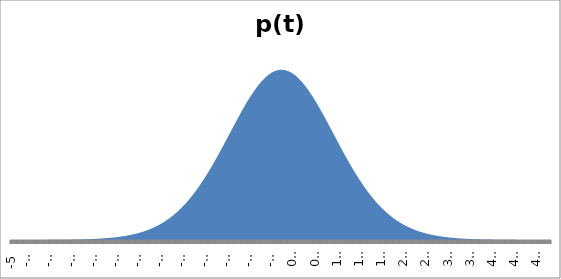
| Category | p(t) |
|---|---|
| -5.0 | 0 |
| -4.99 | 0 |
| -4.98 | 0 |
| -4.970000000000001 | 0 |
| -4.960000000000001 | 0 |
| -4.950000000000001 | 0 |
| -4.940000000000001 | 0 |
| -4.9300000000000015 | 0 |
| -4.920000000000002 | 0 |
| -4.910000000000002 | 0 |
| -4.900000000000002 | 0 |
| -4.890000000000002 | 0 |
| -4.880000000000003 | 0 |
| -4.870000000000003 | 0 |
| -4.860000000000003 | 0 |
| -4.850000000000003 | 0 |
| -4.840000000000003 | 0 |
| -4.830000000000004 | 0 |
| -4.820000000000004 | 0 |
| -4.810000000000004 | 0 |
| -4.800000000000004 | 0 |
| -4.7900000000000045 | 0 |
| -4.780000000000005 | 0 |
| -4.770000000000005 | 0 |
| -4.760000000000005 | 0 |
| -4.750000000000005 | 0 |
| -4.7400000000000055 | 0 |
| -4.730000000000006 | 0 |
| -4.720000000000006 | 0 |
| -4.710000000000006 | 0 |
| -4.700000000000006 | 0 |
| -4.690000000000007 | 0 |
| -4.680000000000007 | 0 |
| -4.670000000000007 | 0 |
| -4.660000000000007 | 0 |
| -4.6500000000000075 | 0 |
| -4.640000000000008 | 0 |
| -4.630000000000008 | 0 |
| -4.620000000000008 | 0 |
| -4.610000000000008 | 0 |
| -4.6000000000000085 | 0 |
| -4.590000000000009 | 0 |
| -4.580000000000009 | 0 |
| -4.570000000000009 | 0 |
| -4.560000000000009 | 0 |
| -4.55000000000001 | 0 |
| -4.54000000000001 | 0 |
| -4.53000000000001 | 0 |
| -4.52000000000001 | 0 |
| -4.5100000000000104 | 0 |
| -4.500000000000011 | 0 |
| -4.490000000000011 | 0 |
| -4.480000000000011 | 0 |
| -4.470000000000011 | 0 |
| -4.4600000000000115 | 0 |
| -4.450000000000012 | 0 |
| -4.440000000000012 | 0 |
| -4.430000000000012 | 0 |
| -4.420000000000012 | 0 |
| -4.410000000000013 | 0 |
| -4.400000000000013 | 0 |
| -4.390000000000013 | 0 |
| -4.380000000000013 | 0 |
| -4.370000000000013 | 0 |
| -4.360000000000014 | 0 |
| -4.350000000000014 | 0 |
| -4.340000000000014 | 0 |
| -4.330000000000014 | 0 |
| -4.3200000000000145 | 0 |
| -4.310000000000015 | 0 |
| -4.300000000000015 | 0 |
| -4.290000000000015 | 0 |
| -4.280000000000015 | 0 |
| -4.270000000000016 | 0 |
| -4.260000000000016 | 0 |
| -4.250000000000016 | 0 |
| -4.240000000000016 | 0 |
| -4.230000000000016 | 0 |
| -4.220000000000017 | 0 |
| -4.210000000000017 | 0 |
| -4.200000000000017 | 0 |
| -4.190000000000017 | 0 |
| -4.1800000000000175 | 0 |
| -4.170000000000018 | 0 |
| -4.160000000000018 | 0 |
| -4.150000000000018 | 0 |
| -4.140000000000018 | 0 |
| -4.1300000000000185 | 0 |
| -4.120000000000019 | 0 |
| -4.110000000000019 | 0.001 |
| -4.100000000000019 | 0.001 |
| -4.090000000000019 | 0.001 |
| -4.08000000000002 | 0.001 |
| -4.07000000000002 | 0.001 |
| -4.06000000000002 | 0.001 |
| -4.05000000000002 | 0.001 |
| -4.0400000000000205 | 0.001 |
| -4.030000000000021 | 0.001 |
| -4.020000000000021 | 0.001 |
| -4.010000000000021 | 0.001 |
| -4.000000000000021 | 0.001 |
| -3.9900000000000215 | 0.001 |
| -3.9800000000000217 | 0.001 |
| -3.970000000000022 | 0.001 |
| -3.960000000000022 | 0.001 |
| -3.9500000000000224 | 0.001 |
| -3.9400000000000226 | 0.001 |
| -3.930000000000023 | 0.001 |
| -3.920000000000023 | 0.001 |
| -3.9100000000000232 | 0.001 |
| -3.9000000000000234 | 0.001 |
| -3.8900000000000237 | 0.001 |
| -3.880000000000024 | 0.001 |
| -3.870000000000024 | 0.001 |
| -3.8600000000000243 | 0.001 |
| -3.8500000000000245 | 0.001 |
| -3.8400000000000247 | 0.001 |
| -3.830000000000025 | 0.001 |
| -3.820000000000025 | 0.001 |
| -3.8100000000000254 | 0.001 |
| -3.8000000000000256 | 0.001 |
| -3.790000000000026 | 0.001 |
| -3.780000000000026 | 0.001 |
| -3.770000000000026 | 0.001 |
| -3.7600000000000264 | 0.001 |
| -3.7500000000000266 | 0.001 |
| -3.740000000000027 | 0.001 |
| -3.730000000000027 | 0.001 |
| -3.7200000000000273 | 0.001 |
| -3.7100000000000275 | 0.001 |
| -3.7000000000000277 | 0.001 |
| -3.690000000000028 | 0.001 |
| -3.680000000000028 | 0.001 |
| -3.6700000000000284 | 0.002 |
| -3.6600000000000286 | 0.002 |
| -3.6500000000000288 | 0.002 |
| -3.640000000000029 | 0.002 |
| -3.630000000000029 | 0.002 |
| -3.6200000000000294 | 0.002 |
| -3.6100000000000296 | 0.002 |
| -3.60000000000003 | 0.002 |
| -3.59000000000003 | 0.002 |
| -3.5800000000000303 | 0.002 |
| -3.5700000000000305 | 0.002 |
| -3.5600000000000307 | 0.002 |
| -3.550000000000031 | 0.002 |
| -3.540000000000031 | 0.002 |
| -3.5300000000000313 | 0.002 |
| -3.5200000000000315 | 0.002 |
| -3.5100000000000318 | 0.002 |
| -3.500000000000032 | 0.002 |
| -3.490000000000032 | 0.002 |
| -3.4800000000000324 | 0.002 |
| -3.4700000000000326 | 0.002 |
| -3.460000000000033 | 0.003 |
| -3.450000000000033 | 0.003 |
| -3.4400000000000333 | 0.003 |
| -3.4300000000000335 | 0.003 |
| -3.4200000000000337 | 0.003 |
| -3.410000000000034 | 0.003 |
| -3.400000000000034 | 0.003 |
| -3.3900000000000343 | 0.003 |
| -3.3800000000000345 | 0.003 |
| -3.3700000000000347 | 0.003 |
| -3.360000000000035 | 0.003 |
| -3.350000000000035 | 0.003 |
| -3.3400000000000354 | 0.003 |
| -3.3300000000000356 | 0.003 |
| -3.320000000000036 | 0.004 |
| -3.310000000000036 | 0.004 |
| -3.3000000000000362 | 0.004 |
| -3.2900000000000365 | 0.004 |
| -3.2800000000000367 | 0.004 |
| -3.270000000000037 | 0.004 |
| -3.260000000000037 | 0.004 |
| -3.2500000000000373 | 0.004 |
| -3.2400000000000375 | 0.004 |
| -3.2300000000000377 | 0.004 |
| -3.220000000000038 | 0.004 |
| -3.210000000000038 | 0.005 |
| -3.2000000000000384 | 0.005 |
| -3.1900000000000386 | 0.005 |
| -3.180000000000039 | 0.005 |
| -3.170000000000039 | 0.005 |
| -3.160000000000039 | 0.005 |
| -3.1500000000000394 | 0.005 |
| -3.1400000000000396 | 0.005 |
| -3.13000000000004 | 0.005 |
| -3.12000000000004 | 0.006 |
| -3.1100000000000403 | 0.006 |
| -3.1000000000000405 | 0.006 |
| -3.0900000000000407 | 0.006 |
| -3.080000000000041 | 0.006 |
| -3.070000000000041 | 0.006 |
| -3.0600000000000414 | 0.006 |
| -3.0500000000000416 | 0.007 |
| -3.040000000000042 | 0.007 |
| -3.030000000000042 | 0.007 |
| -3.020000000000042 | 0.007 |
| -3.0100000000000424 | 0.007 |
| -3.0000000000000426 | 0.007 |
| -2.990000000000043 | 0.008 |
| -2.980000000000043 | 0.008 |
| -2.9700000000000433 | 0.008 |
| -2.9600000000000435 | 0.008 |
| -2.9500000000000437 | 0.008 |
| -2.940000000000044 | 0.008 |
| -2.930000000000044 | 0.009 |
| -2.9200000000000443 | 0.009 |
| -2.9100000000000446 | 0.009 |
| -2.9000000000000448 | 0.009 |
| -2.890000000000045 | 0.009 |
| -2.880000000000045 | 0.01 |
| -2.8700000000000454 | 0.01 |
| -2.8600000000000456 | 0.01 |
| -2.850000000000046 | 0.01 |
| -2.840000000000046 | 0.011 |
| -2.8300000000000463 | 0.011 |
| -2.8200000000000465 | 0.011 |
| -2.8100000000000467 | 0.011 |
| -2.800000000000047 | 0.012 |
| -2.790000000000047 | 0.012 |
| -2.7800000000000473 | 0.012 |
| -2.7700000000000475 | 0.012 |
| -2.7600000000000477 | 0.013 |
| -2.750000000000048 | 0.013 |
| -2.740000000000048 | 0.013 |
| -2.7300000000000484 | 0.013 |
| -2.7200000000000486 | 0.014 |
| -2.710000000000049 | 0.014 |
| -2.700000000000049 | 0.014 |
| -2.6900000000000492 | 0.015 |
| -2.6800000000000495 | 0.015 |
| -2.6700000000000497 | 0.015 |
| -2.66000000000005 | 0.016 |
| -2.65000000000005 | 0.016 |
| -2.6400000000000503 | 0.016 |
| -2.6300000000000505 | 0.017 |
| -2.6200000000000507 | 0.017 |
| -2.610000000000051 | 0.017 |
| -2.600000000000051 | 0.018 |
| -2.5900000000000514 | 0.018 |
| -2.5800000000000516 | 0.019 |
| -2.570000000000052 | 0.019 |
| -2.560000000000052 | 0.019 |
| -2.5500000000000522 | 0.02 |
| -2.5400000000000524 | 0.02 |
| -2.5300000000000527 | 0.021 |
| -2.520000000000053 | 0.021 |
| -2.510000000000053 | 0.021 |
| -2.5000000000000533 | 0.022 |
| -2.4900000000000535 | 0.022 |
| -2.4800000000000537 | 0.023 |
| -2.470000000000054 | 0.023 |
| -2.460000000000054 | 0.024 |
| -2.4500000000000544 | 0.024 |
| -2.4400000000000546 | 0.025 |
| -2.430000000000055 | 0.025 |
| -2.420000000000055 | 0.026 |
| -2.410000000000055 | 0.026 |
| -2.4000000000000554 | 0.027 |
| -2.3900000000000556 | 0.027 |
| -2.380000000000056 | 0.028 |
| -2.370000000000056 | 0.028 |
| -2.3600000000000563 | 0.029 |
| -2.3500000000000565 | 0.03 |
| -2.3400000000000567 | 0.03 |
| -2.330000000000057 | 0.031 |
| -2.320000000000057 | 0.031 |
| -2.3100000000000573 | 0.032 |
| -2.3000000000000576 | 0.033 |
| -2.2900000000000578 | 0.033 |
| -2.280000000000058 | 0.034 |
| -2.270000000000058 | 0.035 |
| -2.2600000000000584 | 0.035 |
| -2.2500000000000586 | 0.036 |
| -2.240000000000059 | 0.037 |
| -2.230000000000059 | 0.038 |
| -2.2200000000000593 | 0.038 |
| -2.2100000000000595 | 0.039 |
| -2.2000000000000597 | 0.04 |
| -2.19000000000006 | 0.04 |
| -2.18000000000006 | 0.041 |
| -2.1700000000000603 | 0.042 |
| -2.1600000000000605 | 0.043 |
| -2.1500000000000608 | 0.044 |
| -2.140000000000061 | 0.044 |
| -2.130000000000061 | 0.045 |
| -2.1200000000000614 | 0.046 |
| -2.1100000000000616 | 0.047 |
| -2.100000000000062 | 0.048 |
| -2.090000000000062 | 0.049 |
| -2.0800000000000622 | 0.05 |
| -2.0700000000000625 | 0.051 |
| -2.0600000000000627 | 0.052 |
| -2.050000000000063 | 0.053 |
| -2.040000000000063 | 0.053 |
| -2.0300000000000633 | 0.054 |
| -2.0200000000000635 | 0.055 |
| -2.0100000000000637 | 0.056 |
| -2.000000000000064 | 0.057 |
| -1.990000000000064 | 0.059 |
| -1.980000000000064 | 0.06 |
| -1.970000000000064 | 0.061 |
| -1.960000000000064 | 0.062 |
| -1.950000000000064 | 0.063 |
| -1.940000000000064 | 0.064 |
| -1.9300000000000639 | 0.065 |
| -1.9200000000000639 | 0.066 |
| -1.9100000000000639 | 0.067 |
| -1.9000000000000639 | 0.069 |
| -1.8900000000000639 | 0.07 |
| -1.8800000000000638 | 0.071 |
| -1.8700000000000638 | 0.072 |
| -1.8600000000000638 | 0.073 |
| -1.8500000000000638 | 0.075 |
| -1.8400000000000638 | 0.076 |
| -1.8300000000000638 | 0.077 |
| -1.8200000000000638 | 0.078 |
| -1.8100000000000638 | 0.08 |
| -1.8000000000000638 | 0.081 |
| -1.7900000000000638 | 0.082 |
| -1.7800000000000638 | 0.084 |
| -1.7700000000000637 | 0.085 |
| -1.7600000000000637 | 0.087 |
| -1.7500000000000637 | 0.088 |
| -1.7400000000000637 | 0.089 |
| -1.7300000000000637 | 0.091 |
| -1.7200000000000637 | 0.092 |
| -1.7100000000000637 | 0.094 |
| -1.7000000000000637 | 0.095 |
| -1.6900000000000637 | 0.097 |
| -1.6800000000000637 | 0.098 |
| -1.6700000000000637 | 0.1 |
| -1.6600000000000636 | 0.101 |
| -1.6500000000000636 | 0.103 |
| -1.6400000000000636 | 0.105 |
| -1.6300000000000636 | 0.106 |
| -1.6200000000000636 | 0.108 |
| -1.6100000000000636 | 0.11 |
| -1.6000000000000636 | 0.111 |
| -1.5900000000000636 | 0.113 |
| -1.5800000000000636 | 0.115 |
| -1.5700000000000636 | 0.116 |
| -1.5600000000000636 | 0.118 |
| -1.5500000000000635 | 0.12 |
| -1.5400000000000635 | 0.122 |
| -1.5300000000000635 | 0.123 |
| -1.5200000000000635 | 0.125 |
| -1.5100000000000635 | 0.127 |
| -1.5000000000000635 | 0.129 |
| -1.4900000000000635 | 0.131 |
| -1.4800000000000635 | 0.133 |
| -1.4700000000000635 | 0.134 |
| -1.4600000000000635 | 0.136 |
| -1.4500000000000635 | 0.138 |
| -1.4400000000000635 | 0.14 |
| -1.4300000000000634 | 0.142 |
| -1.4200000000000634 | 0.144 |
| -1.4100000000000634 | 0.146 |
| -1.4000000000000634 | 0.148 |
| -1.3900000000000634 | 0.15 |
| -1.3800000000000634 | 0.152 |
| -1.3700000000000634 | 0.154 |
| -1.3600000000000634 | 0.156 |
| -1.3500000000000634 | 0.158 |
| -1.3400000000000634 | 0.16 |
| -1.3300000000000634 | 0.162 |
| -1.3200000000000633 | 0.164 |
| -1.3100000000000633 | 0.167 |
| -1.3000000000000633 | 0.169 |
| -1.2900000000000633 | 0.171 |
| -1.2800000000000633 | 0.173 |
| -1.2700000000000633 | 0.175 |
| -1.2600000000000633 | 0.177 |
| -1.2500000000000633 | 0.179 |
| -1.2400000000000633 | 0.182 |
| -1.2300000000000633 | 0.184 |
| -1.2200000000000633 | 0.186 |
| -1.2100000000000632 | 0.188 |
| -1.2000000000000632 | 0.191 |
| -1.1900000000000632 | 0.193 |
| -1.1800000000000632 | 0.195 |
| -1.1700000000000632 | 0.197 |
| -1.1600000000000632 | 0.2 |
| -1.1500000000000632 | 0.202 |
| -1.1400000000000632 | 0.204 |
| -1.1300000000000632 | 0.207 |
| -1.1200000000000632 | 0.209 |
| -1.1100000000000632 | 0.211 |
| -1.1000000000000631 | 0.213 |
| -1.0900000000000631 | 0.216 |
| -1.0800000000000631 | 0.218 |
| -1.0700000000000631 | 0.22 |
| -1.0600000000000631 | 0.223 |
| -1.050000000000063 | 0.225 |
| -1.040000000000063 | 0.228 |
| -1.030000000000063 | 0.23 |
| -1.020000000000063 | 0.232 |
| -1.010000000000063 | 0.235 |
| -1.000000000000063 | 0.237 |
| -0.990000000000063 | 0.239 |
| -0.980000000000063 | 0.242 |
| -0.970000000000063 | 0.244 |
| -0.960000000000063 | 0.247 |
| -0.950000000000063 | 0.249 |
| -0.940000000000063 | 0.251 |
| -0.930000000000063 | 0.254 |
| -0.920000000000063 | 0.256 |
| -0.910000000000063 | 0.258 |
| -0.900000000000063 | 0.261 |
| -0.890000000000063 | 0.263 |
| -0.880000000000063 | 0.265 |
| -0.870000000000063 | 0.268 |
| -0.8600000000000629 | 0.27 |
| -0.8500000000000629 | 0.273 |
| -0.8400000000000629 | 0.275 |
| -0.8300000000000629 | 0.277 |
| -0.8200000000000629 | 0.28 |
| -0.8100000000000629 | 0.282 |
| -0.8000000000000629 | 0.284 |
| -0.7900000000000629 | 0.286 |
| -0.7800000000000629 | 0.289 |
| -0.7700000000000629 | 0.291 |
| -0.7600000000000628 | 0.293 |
| -0.7500000000000628 | 0.296 |
| -0.7400000000000628 | 0.298 |
| -0.7300000000000628 | 0.3 |
| -0.7200000000000628 | 0.302 |
| -0.7100000000000628 | 0.304 |
| -0.7000000000000628 | 0.307 |
| -0.6900000000000628 | 0.309 |
| -0.6800000000000628 | 0.311 |
| -0.6700000000000628 | 0.313 |
| -0.6600000000000628 | 0.315 |
| -0.6500000000000627 | 0.317 |
| -0.6400000000000627 | 0.32 |
| -0.6300000000000627 | 0.322 |
| -0.6200000000000627 | 0.324 |
| -0.6100000000000627 | 0.326 |
| -0.6000000000000627 | 0.328 |
| -0.5900000000000627 | 0.33 |
| -0.5800000000000627 | 0.332 |
| -0.5700000000000627 | 0.334 |
| -0.5600000000000627 | 0.336 |
| -0.5500000000000627 | 0.338 |
| -0.5400000000000627 | 0.339 |
| -0.5300000000000626 | 0.341 |
| -0.5200000000000626 | 0.343 |
| -0.5100000000000626 | 0.345 |
| -0.5000000000000626 | 0.347 |
| -0.4900000000000626 | 0.349 |
| -0.4800000000000626 | 0.35 |
| -0.4700000000000626 | 0.352 |
| -0.4600000000000626 | 0.354 |
| -0.45000000000006257 | 0.355 |
| -0.44000000000006256 | 0.357 |
| -0.43000000000006255 | 0.359 |
| -0.42000000000006255 | 0.36 |
| -0.41000000000006254 | 0.362 |
| -0.40000000000006253 | 0.363 |
| -0.3900000000000625 | 0.365 |
| -0.3800000000000625 | 0.366 |
| -0.3700000000000625 | 0.368 |
| -0.3600000000000625 | 0.369 |
| -0.3500000000000625 | 0.37 |
| -0.3400000000000625 | 0.372 |
| -0.33000000000006247 | 0.373 |
| -0.32000000000006246 | 0.374 |
| -0.31000000000006245 | 0.376 |
| -0.30000000000006244 | 0.377 |
| -0.29000000000006243 | 0.378 |
| -0.2800000000000624 | 0.379 |
| -0.2700000000000624 | 0.38 |
| -0.2600000000000624 | 0.381 |
| -0.2500000000000624 | 0.382 |
| -0.24000000000006239 | 0.383 |
| -0.23000000000006238 | 0.384 |
| -0.22000000000006237 | 0.385 |
| -0.21000000000006236 | 0.386 |
| -0.20000000000006235 | 0.387 |
| -0.19000000000006234 | 0.387 |
| -0.18000000000006233 | 0.388 |
| -0.17000000000006232 | 0.389 |
| -0.16000000000006231 | 0.39 |
| -0.1500000000000623 | 0.39 |
| -0.1400000000000623 | 0.391 |
| -0.1300000000000623 | 0.391 |
| -0.12000000000006229 | 0.392 |
| -0.1100000000000623 | 0.392 |
| -0.1000000000000623 | 0.393 |
| -0.09000000000006231 | 0.393 |
| -0.08000000000006231 | 0.393 |
| -0.07000000000006232 | 0.394 |
| -0.060000000000062316 | 0.394 |
| -0.050000000000062314 | 0.394 |
| -0.04000000000006231 | 0.394 |
| -0.03000000000006231 | 0.395 |
| -0.020000000000062308 | 0.395 |
| -0.010000000000062308 | 0.395 |
| -6.230779781013496e-14 | 0.395 |
| 0.009999999999937692 | 0.395 |
| 0.019999999999937693 | 0.395 |
| 0.029999999999937695 | 0.395 |
| 0.039999999999937697 | 0.394 |
| 0.0499999999999377 | 0.394 |
| 0.0599999999999377 | 0.394 |
| 0.0699999999999377 | 0.394 |
| 0.07999999999993769 | 0.393 |
| 0.08999999999993769 | 0.393 |
| 0.09999999999993768 | 0.393 |
| 0.10999999999993768 | 0.392 |
| 0.11999999999993767 | 0.392 |
| 0.12999999999993767 | 0.391 |
| 0.13999999999993767 | 0.391 |
| 0.14999999999993768 | 0.39 |
| 0.1599999999999377 | 0.39 |
| 0.1699999999999377 | 0.389 |
| 0.1799999999999377 | 0.388 |
| 0.18999999999993772 | 0.387 |
| 0.19999999999993773 | 0.387 |
| 0.20999999999993774 | 0.386 |
| 0.21999999999993775 | 0.385 |
| 0.22999999999993775 | 0.384 |
| 0.23999999999993776 | 0.383 |
| 0.24999999999993777 | 0.382 |
| 0.2599999999999378 | 0.381 |
| 0.2699999999999378 | 0.38 |
| 0.2799999999999378 | 0.379 |
| 0.2899999999999378 | 0.378 |
| 0.2999999999999378 | 0.377 |
| 0.3099999999999378 | 0.376 |
| 0.31999999999993783 | 0.374 |
| 0.32999999999993784 | 0.373 |
| 0.33999999999993785 | 0.372 |
| 0.34999999999993786 | 0.37 |
| 0.35999999999993787 | 0.369 |
| 0.3699999999999379 | 0.368 |
| 0.3799999999999379 | 0.366 |
| 0.3899999999999379 | 0.365 |
| 0.3999999999999379 | 0.363 |
| 0.4099999999999379 | 0.362 |
| 0.4199999999999379 | 0.36 |
| 0.42999999999993793 | 0.359 |
| 0.43999999999993794 | 0.357 |
| 0.44999999999993795 | 0.355 |
| 0.45999999999993796 | 0.354 |
| 0.46999999999993797 | 0.352 |
| 0.479999999999938 | 0.35 |
| 0.489999999999938 | 0.349 |
| 0.499999999999938 | 0.347 |
| 0.509999999999938 | 0.345 |
| 0.519999999999938 | 0.343 |
| 0.529999999999938 | 0.341 |
| 0.539999999999938 | 0.339 |
| 0.549999999999938 | 0.338 |
| 0.559999999999938 | 0.336 |
| 0.569999999999938 | 0.334 |
| 0.579999999999938 | 0.332 |
| 0.589999999999938 | 0.33 |
| 0.599999999999938 | 0.328 |
| 0.609999999999938 | 0.326 |
| 0.619999999999938 | 0.324 |
| 0.629999999999938 | 0.322 |
| 0.6399999999999381 | 0.32 |
| 0.6499999999999381 | 0.317 |
| 0.6599999999999381 | 0.315 |
| 0.6699999999999381 | 0.313 |
| 0.6799999999999381 | 0.311 |
| 0.6899999999999381 | 0.309 |
| 0.6999999999999381 | 0.307 |
| 0.7099999999999381 | 0.304 |
| 0.7199999999999381 | 0.302 |
| 0.7299999999999381 | 0.3 |
| 0.7399999999999382 | 0.298 |
| 0.7499999999999382 | 0.296 |
| 0.7599999999999382 | 0.293 |
| 0.7699999999999382 | 0.291 |
| 0.7799999999999382 | 0.289 |
| 0.7899999999999382 | 0.286 |
| 0.7999999999999382 | 0.284 |
| 0.8099999999999382 | 0.282 |
| 0.8199999999999382 | 0.28 |
| 0.8299999999999382 | 0.277 |
| 0.8399999999999382 | 0.275 |
| 0.8499999999999382 | 0.273 |
| 0.8599999999999383 | 0.27 |
| 0.8699999999999383 | 0.268 |
| 0.8799999999999383 | 0.265 |
| 0.8899999999999383 | 0.263 |
| 0.8999999999999383 | 0.261 |
| 0.9099999999999383 | 0.258 |
| 0.9199999999999383 | 0.256 |
| 0.9299999999999383 | 0.254 |
| 0.9399999999999383 | 0.251 |
| 0.9499999999999383 | 0.249 |
| 0.9599999999999383 | 0.247 |
| 0.9699999999999384 | 0.244 |
| 0.9799999999999384 | 0.242 |
| 0.9899999999999384 | 0.239 |
| 0.9999999999999384 | 0.237 |
| 1.0099999999999383 | 0.235 |
| 1.0199999999999383 | 0.232 |
| 1.0299999999999383 | 0.23 |
| 1.0399999999999383 | 0.228 |
| 1.0499999999999383 | 0.225 |
| 1.0599999999999383 | 0.223 |
| 1.0699999999999383 | 0.22 |
| 1.0799999999999383 | 0.218 |
| 1.0899999999999384 | 0.216 |
| 1.0999999999999384 | 0.213 |
| 1.1099999999999384 | 0.211 |
| 1.1199999999999384 | 0.209 |
| 1.1299999999999384 | 0.207 |
| 1.1399999999999384 | 0.204 |
| 1.1499999999999384 | 0.202 |
| 1.1599999999999384 | 0.2 |
| 1.1699999999999384 | 0.197 |
| 1.1799999999999384 | 0.195 |
| 1.1899999999999384 | 0.193 |
| 1.1999999999999384 | 0.191 |
| 1.2099999999999385 | 0.188 |
| 1.2199999999999385 | 0.186 |
| 1.2299999999999385 | 0.184 |
| 1.2399999999999385 | 0.182 |
| 1.2499999999999385 | 0.179 |
| 1.2599999999999385 | 0.177 |
| 1.2699999999999385 | 0.175 |
| 1.2799999999999385 | 0.173 |
| 1.2899999999999385 | 0.171 |
| 1.2999999999999385 | 0.169 |
| 1.3099999999999385 | 0.167 |
| 1.3199999999999386 | 0.164 |
| 1.3299999999999386 | 0.162 |
| 1.3399999999999386 | 0.16 |
| 1.3499999999999386 | 0.158 |
| 1.3599999999999386 | 0.156 |
| 1.3699999999999386 | 0.154 |
| 1.3799999999999386 | 0.152 |
| 1.3899999999999386 | 0.15 |
| 1.3999999999999386 | 0.148 |
| 1.4099999999999386 | 0.146 |
| 1.4199999999999386 | 0.144 |
| 1.4299999999999387 | 0.142 |
| 1.4399999999999387 | 0.14 |
| 1.4499999999999387 | 0.138 |
| 1.4599999999999387 | 0.136 |
| 1.4699999999999387 | 0.134 |
| 1.4799999999999387 | 0.133 |
| 1.4899999999999387 | 0.131 |
| 1.4999999999999387 | 0.129 |
| 1.5099999999999387 | 0.127 |
| 1.5199999999999387 | 0.125 |
| 1.5299999999999387 | 0.123 |
| 1.5399999999999388 | 0.122 |
| 1.5499999999999388 | 0.12 |
| 1.5599999999999388 | 0.118 |
| 1.5699999999999388 | 0.116 |
| 1.5799999999999388 | 0.115 |
| 1.5899999999999388 | 0.113 |
| 1.5999999999999388 | 0.111 |
| 1.6099999999999388 | 0.11 |
| 1.6199999999999388 | 0.108 |
| 1.6299999999999388 | 0.106 |
| 1.6399999999999388 | 0.105 |
| 1.6499999999999388 | 0.103 |
| 1.6599999999999389 | 0.101 |
| 1.6699999999999389 | 0.1 |
| 1.6799999999999389 | 0.098 |
| 1.6899999999999389 | 0.097 |
| 1.699999999999939 | 0.095 |
| 1.709999999999939 | 0.094 |
| 1.719999999999939 | 0.092 |
| 1.729999999999939 | 0.091 |
| 1.739999999999939 | 0.089 |
| 1.749999999999939 | 0.088 |
| 1.759999999999939 | 0.087 |
| 1.769999999999939 | 0.085 |
| 1.779999999999939 | 0.084 |
| 1.789999999999939 | 0.082 |
| 1.799999999999939 | 0.081 |
| 1.809999999999939 | 0.08 |
| 1.819999999999939 | 0.078 |
| 1.829999999999939 | 0.077 |
| 1.839999999999939 | 0.076 |
| 1.849999999999939 | 0.075 |
| 1.859999999999939 | 0.073 |
| 1.869999999999939 | 0.072 |
| 1.879999999999939 | 0.071 |
| 1.889999999999939 | 0.07 |
| 1.899999999999939 | 0.069 |
| 1.909999999999939 | 0.067 |
| 1.919999999999939 | 0.066 |
| 1.929999999999939 | 0.065 |
| 1.939999999999939 | 0.064 |
| 1.9499999999999391 | 0.063 |
| 1.9599999999999391 | 0.062 |
| 1.9699999999999391 | 0.061 |
| 1.9799999999999391 | 0.06 |
| 1.9899999999999392 | 0.059 |
| 1.9999999999999392 | 0.057 |
| 2.009999999999939 | 0.056 |
| 2.0199999999999387 | 0.055 |
| 2.0299999999999385 | 0.054 |
| 2.0399999999999383 | 0.053 |
| 2.049999999999938 | 0.053 |
| 2.059999999999938 | 0.052 |
| 2.0699999999999377 | 0.051 |
| 2.0799999999999375 | 0.05 |
| 2.0899999999999372 | 0.049 |
| 2.099999999999937 | 0.048 |
| 2.109999999999937 | 0.047 |
| 2.1199999999999366 | 0.046 |
| 2.1299999999999364 | 0.045 |
| 2.139999999999936 | 0.044 |
| 2.149999999999936 | 0.044 |
| 2.1599999999999357 | 0.043 |
| 2.1699999999999355 | 0.042 |
| 2.1799999999999353 | 0.041 |
| 2.189999999999935 | 0.04 |
| 2.199999999999935 | 0.04 |
| 2.2099999999999347 | 0.039 |
| 2.2199999999999345 | 0.038 |
| 2.2299999999999343 | 0.038 |
| 2.239999999999934 | 0.037 |
| 2.249999999999934 | 0.036 |
| 2.2599999999999336 | 0.035 |
| 2.2699999999999334 | 0.035 |
| 2.279999999999933 | 0.034 |
| 2.289999999999933 | 0.033 |
| 2.2999999999999328 | 0.033 |
| 2.3099999999999326 | 0.032 |
| 2.3199999999999323 | 0.031 |
| 2.329999999999932 | 0.031 |
| 2.339999999999932 | 0.03 |
| 2.3499999999999317 | 0.03 |
| 2.3599999999999315 | 0.029 |
| 2.3699999999999313 | 0.028 |
| 2.379999999999931 | 0.028 |
| 2.389999999999931 | 0.027 |
| 2.3999999999999306 | 0.027 |
| 2.4099999999999304 | 0.026 |
| 2.41999999999993 | 0.026 |
| 2.42999999999993 | 0.025 |
| 2.43999999999993 | 0.025 |
| 2.4499999999999296 | 0.024 |
| 2.4599999999999294 | 0.024 |
| 2.469999999999929 | 0.023 |
| 2.479999999999929 | 0.023 |
| 2.4899999999999287 | 0.022 |
| 2.4999999999999285 | 0.022 |
| 2.5099999999999283 | 0.021 |
| 2.519999999999928 | 0.021 |
| 2.529999999999928 | 0.021 |
| 2.5399999999999276 | 0.02 |
| 2.5499999999999274 | 0.02 |
| 2.5599999999999272 | 0.019 |
| 2.569999999999927 | 0.019 |
| 2.579999999999927 | 0.019 |
| 2.5899999999999266 | 0.018 |
| 2.5999999999999264 | 0.018 |
| 2.609999999999926 | 0.017 |
| 2.619999999999926 | 0.017 |
| 2.6299999999999257 | 0.017 |
| 2.6399999999999255 | 0.016 |
| 2.6499999999999253 | 0.016 |
| 2.659999999999925 | 0.016 |
| 2.669999999999925 | 0.015 |
| 2.6799999999999247 | 0.015 |
| 2.6899999999999245 | 0.015 |
| 2.6999999999999242 | 0.014 |
| 2.709999999999924 | 0.014 |
| 2.719999999999924 | 0.014 |
| 2.7299999999999236 | 0.013 |
| 2.7399999999999234 | 0.013 |
| 2.749999999999923 | 0.013 |
| 2.759999999999923 | 0.013 |
| 2.7699999999999227 | 0.012 |
| 2.7799999999999225 | 0.012 |
| 2.7899999999999223 | 0.012 |
| 2.799999999999922 | 0.012 |
| 2.809999999999922 | 0.011 |
| 2.8199999999999217 | 0.011 |
| 2.8299999999999215 | 0.011 |
| 2.8399999999999213 | 0.011 |
| 2.849999999999921 | 0.01 |
| 2.859999999999921 | 0.01 |
| 2.8699999999999206 | 0.01 |
| 2.8799999999999204 | 0.01 |
| 2.88999999999992 | 0.009 |
| 2.89999999999992 | 0.009 |
| 2.9099999999999198 | 0.009 |
| 2.9199999999999195 | 0.009 |
| 2.9299999999999193 | 0.009 |
| 2.939999999999919 | 0.008 |
| 2.949999999999919 | 0.008 |
| 2.9599999999999187 | 0.008 |
| 2.9699999999999185 | 0.008 |
| 2.9799999999999183 | 0.008 |
| 2.989999999999918 | 0.008 |
| 2.999999999999918 | 0.007 |
| 3.0099999999999176 | 0.007 |
| 3.0199999999999174 | 0.007 |
| 3.029999999999917 | 0.007 |
| 3.039999999999917 | 0.007 |
| 3.0499999999999168 | 0.007 |
| 3.0599999999999166 | 0.006 |
| 3.0699999999999164 | 0.006 |
| 3.079999999999916 | 0.006 |
| 3.089999999999916 | 0.006 |
| 3.0999999999999157 | 0.006 |
| 3.1099999999999155 | 0.006 |
| 3.1199999999999153 | 0.006 |
| 3.129999999999915 | 0.005 |
| 3.139999999999915 | 0.005 |
| 3.1499999999999146 | 0.005 |
| 3.1599999999999144 | 0.005 |
| 3.169999999999914 | 0.005 |
| 3.179999999999914 | 0.005 |
| 3.189999999999914 | 0.005 |
| 3.1999999999999136 | 0.005 |
| 3.2099999999999134 | 0.005 |
| 3.219999999999913 | 0.004 |
| 3.229999999999913 | 0.004 |
| 3.2399999999999127 | 0.004 |
| 3.2499999999999125 | 0.004 |
| 3.2599999999999123 | 0.004 |
| 3.269999999999912 | 0.004 |
| 3.279999999999912 | 0.004 |
| 3.2899999999999117 | 0.004 |
| 3.2999999999999114 | 0.004 |
| 3.3099999999999112 | 0.004 |
| 3.319999999999911 | 0.004 |
| 3.329999999999911 | 0.003 |
| 3.3399999999999106 | 0.003 |
| 3.3499999999999104 | 0.003 |
| 3.35999999999991 | 0.003 |
| 3.36999999999991 | 0.003 |
| 3.3799999999999097 | 0.003 |
| 3.3899999999999095 | 0.003 |
| 3.3999999999999093 | 0.003 |
| 3.409999999999909 | 0.003 |
| 3.419999999999909 | 0.003 |
| 3.4299999999999087 | 0.003 |
| 3.4399999999999085 | 0.003 |
| 3.4499999999999083 | 0.003 |
| 3.459999999999908 | 0.003 |
| 3.469999999999908 | 0.002 |
| 3.4799999999999076 | 0.002 |
| 3.4899999999999074 | 0.002 |
| 3.499999999999907 | 0.002 |
| 3.509999999999907 | 0.002 |
| 3.5199999999999068 | 0.002 |
| 3.5299999999999065 | 0.002 |
| 3.5399999999999063 | 0.002 |
| 3.549999999999906 | 0.002 |
| 3.559999999999906 | 0.002 |
| 3.5699999999999057 | 0.002 |
| 3.5799999999999055 | 0.002 |
| 3.5899999999999053 | 0.002 |
| 3.599999999999905 | 0.002 |
| 3.609999999999905 | 0.002 |
| 3.6199999999999046 | 0.002 |
| 3.6299999999999044 | 0.002 |
| 3.639999999999904 | 0.002 |
| 3.649999999999904 | 0.002 |
| 3.6599999999999038 | 0.002 |
| 3.6699999999999036 | 0.002 |
| 3.6799999999999033 | 0.001 |
| 3.689999999999903 | 0.001 |
| 3.699999999999903 | 0.001 |
| 3.7099999999999027 | 0.001 |
| 3.7199999999999025 | 0.001 |
| 3.7299999999999023 | 0.001 |
| 3.739999999999902 | 0.001 |
| 3.749999999999902 | 0.001 |
| 3.7599999999999016 | 0.001 |
| 3.7699999999999014 | 0.001 |
| 3.779999999999901 | 0.001 |
| 3.789999999999901 | 0.001 |
| 3.799999999999901 | 0.001 |
| 3.8099999999999006 | 0.001 |
| 3.8199999999999004 | 0.001 |
| 3.8299999999999 | 0.001 |
| 3.8399999999999 | 0.001 |
| 3.8499999999998997 | 0.001 |
| 3.8599999999998995 | 0.001 |
| 3.8699999999998993 | 0.001 |
| 3.879999999999899 | 0.001 |
| 3.889999999999899 | 0.001 |
| 3.8999999999998987 | 0.001 |
| 3.9099999999998984 | 0.001 |
| 3.9199999999998982 | 0.001 |
| 3.929999999999898 | 0.001 |
| 3.939999999999898 | 0.001 |
| 3.9499999999998976 | 0.001 |
| 3.9599999999998974 | 0.001 |
| 3.969999999999897 | 0.001 |
| 3.979999999999897 | 0.001 |
| 3.9899999999998967 | 0.001 |
| 3.9999999999998965 | 0.001 |
| 4.009999999999897 | 0.001 |
| 4.0199999999998965 | 0.001 |
| 4.029999999999896 | 0.001 |
| 4.039999999999896 | 0.001 |
| 4.049999999999896 | 0.001 |
| 4.059999999999896 | 0.001 |
| 4.0699999999998955 | 0.001 |
| 4.079999999999895 | 0.001 |
| 4.089999999999895 | 0.001 |
| 4.099999999999895 | 0.001 |
| 4.109999999999895 | 0.001 |
| 4.119999999999894 | 0 |
| 4.129999999999894 | 0 |
| 4.139999999999894 | 0 |
| 4.149999999999894 | 0 |
| 4.159999999999894 | 0 |
| 4.169999999999893 | 0 |
| 4.179999999999893 | 0 |
| 4.189999999999893 | 0 |
| 4.199999999999893 | 0 |
| 4.2099999999998925 | 0 |
| 4.219999999999892 | 0 |
| 4.229999999999892 | 0 |
| 4.239999999999892 | 0 |
| 4.249999999999892 | 0 |
| 4.259999999999891 | 0 |
| 4.269999999999891 | 0 |
| 4.279999999999891 | 0 |
| 4.289999999999891 | 0 |
| 4.299999999999891 | 0 |
| 4.30999999999989 | 0 |
| 4.31999999999989 | 0 |
| 4.32999999999989 | 0 |
| 4.33999999999989 | 0 |
| 4.3499999999998895 | 0 |
| 4.359999999999889 | 0 |
| 4.369999999999889 | 0 |
| 4.379999999999889 | 0 |
| 4.389999999999889 | 0 |
| 4.3999999999998884 | 0 |
| 4.409999999999888 | 0 |
| 4.419999999999888 | 0 |
| 4.429999999999888 | 0 |
| 4.439999999999888 | 0 |
| 4.449999999999887 | 0 |
| 4.459999999999887 | 0 |
| 4.469999999999887 | 0 |
| 4.479999999999887 | 0 |
| 4.4899999999998865 | 0 |
| 4.499999999999886 | 0 |
| 4.509999999999886 | 0 |
| 4.519999999999886 | 0 |
| 4.529999999999886 | 0 |
| 4.5399999999998855 | 0 |
| 4.549999999999885 | 0 |
| 4.559999999999885 | 0 |
| 4.569999999999885 | 0 |
| 4.579999999999885 | 0 |
| 4.589999999999884 | 0 |
| 4.599999999999884 | 0 |
| 4.609999999999884 | 0 |
| 4.619999999999884 | 0 |
| 4.6299999999998835 | 0 |
| 4.639999999999883 | 0 |
| 4.649999999999883 | 0 |
| 4.659999999999883 | 0 |
| 4.669999999999883 | 0 |
| 4.6799999999998825 | 0 |
| 4.689999999999882 | 0 |
| 4.699999999999882 | 0 |
| 4.709999999999882 | 0 |
| 4.719999999999882 | 0 |
| 4.729999999999881 | 0 |
| 4.739999999999881 | 0 |
| 4.749999999999881 | 0 |
| 4.759999999999881 | 0 |
| 4.769999999999881 | 0 |
| 4.77999999999988 | 0 |
| 4.78999999999988 | 0 |
| 4.79999999999988 | 0 |
| 4.80999999999988 | 0 |
| 4.8199999999998795 | 0 |
| 4.829999999999879 | 0 |
| 4.839999999999879 | 0 |
| 4.849999999999879 | 0 |
| 4.859999999999879 | 0 |
| 4.869999999999878 | 0 |
| 4.879999999999878 | 0 |
| 4.889999999999878 | 0 |
| 4.899999999999878 | 0 |
| 4.909999999999878 | 0 |
| 4.919999999999877 | 0 |
| 4.929999999999877 | 0 |
| 4.939999999999877 | 0 |
| 4.949999999999877 | 0 |
| 4.9599999999998765 | 0 |
| 4.969999999999876 | 0 |
| 4.979999999999876 | 0 |
| 4.989999999999876 | 0 |
| 4.999999999999876 | 0 |